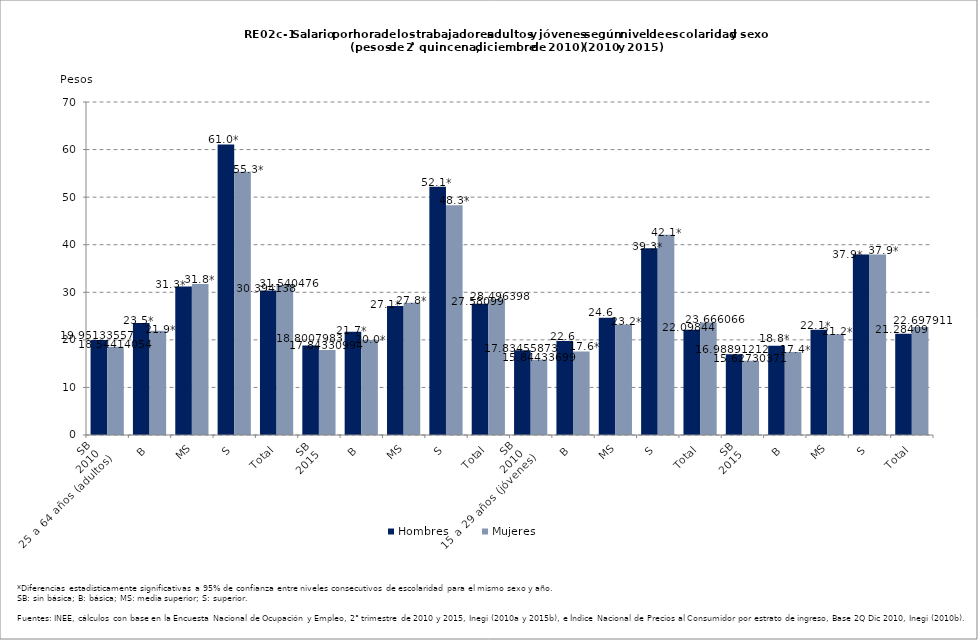
| Category | Hombres  | Mujeres |
|---|---|---|
| 0 | 19.951 | 18.544 |
| 1 | 23.527 | 21.891 |
| 2 | 31.212 | 31.751 |
| 3 | 61.067 | 55.331 |
| 4 | 30.394 | 31.54 |
| 5 | 18.801 | 17.843 |
| 6 | 21.689 | 19.994 |
| 7 | 27.13 | 27.798 |
| 8 | 52.179 | 48.284 |
| 9 | 27.581 | 28.496 |
| 10 | 17.835 | 15.844 |
| 11 | 19.735 | 17.554 |
| 12 | 24.634 | 23.246 |
| 13 | 39.249 | 42.09 |
| 14 | 22.098 | 23.666 |
| 15 | 16.989 | 15.627 |
| 16 | 18.765 | 17.446 |
| 17 | 22.1 | 21.198 |
| 18 | 37.939 | 37.94 |
| 19 | 21.284 | 22.698 |